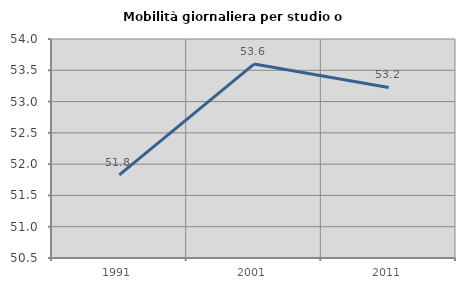
| Category | Mobilità giornaliera per studio o lavoro |
|---|---|
| 1991.0 | 51.827 |
| 2001.0 | 53.599 |
| 2011.0 | 53.225 |